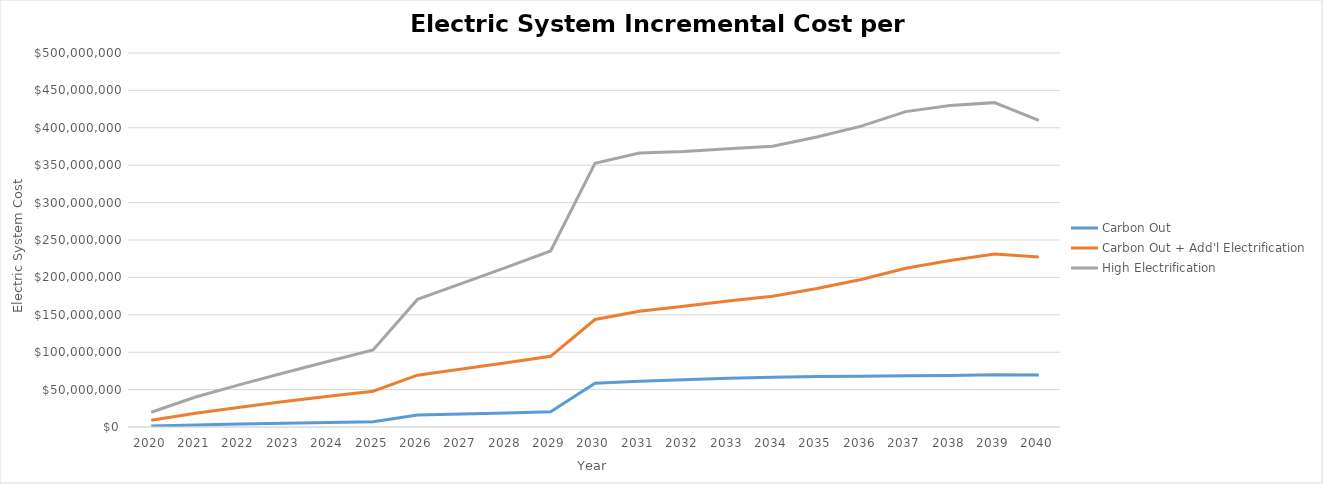
| Category | Carbon Out | Carbon Out + Add'l Electrification | High Electrification |
|---|---|---|---|
| 2020.0 | 1238060.835 | 9087047.942 | 19766509.751 |
| 2021.0 | 2616055.182 | 18491860.381 | 40052301.744 |
| 2022.0 | 3897051.277 | 26418819.051 | 56696274.111 |
| 2023.0 | 5109780.906 | 33972755.383 | 72539058.961 |
| 2024.0 | 6143153.632 | 41123175.651 | 87952027.095 |
| 2025.0 | 6995898.168 | 47906341.591 | 102993828.338 |
| 2026.0 | 16051090.887 | 69278898.148 | 170590808.667 |
| 2027.0 | 17421158.461 | 77599569.471 | 192036296.891 |
| 2028.0 | 18736524.864 | 85890499.533 | 213521530.277 |
| 2029.0 | 20256610.181 | 94449222.389 | 235257461.02 |
| 2030.0 | 58547221.01 | 143735189.202 | 352669175.161 |
| 2031.0 | 61259898.345 | 154742717.99 | 366199995.793 |
| 2032.0 | 63250786.668 | 161364682.796 | 368346210.949 |
| 2033.0 | 65214962.963 | 168438324.405 | 372074050.439 |
| 2034.0 | 66429396.156 | 174946181.229 | 375394077.798 |
| 2035.0 | 67473777.984 | 185205304.997 | 387622147.303 |
| 2036.0 | 67837554.139 | 197149447.953 | 402183899.505 |
| 2037.0 | 68454770.991 | 212180892.834 | 421639565.607 |
| 2038.0 | 68733411.288 | 222642424.955 | 429753904.464 |
| 2039.0 | 69869934.213 | 231171871.223 | 433649533.433 |
| 2040.0 | 69462901.85 | 227204772.875 | 410061342.693 |